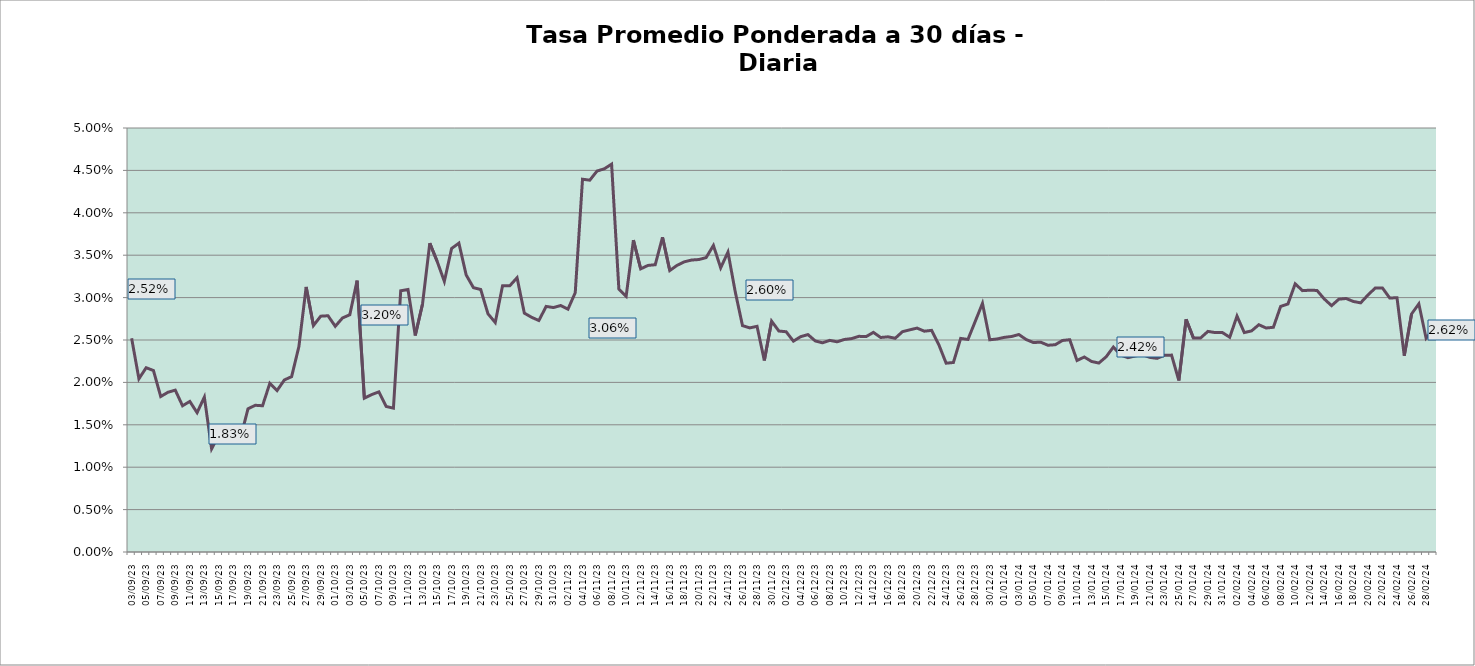
| Category | Tasa a 30 días |
|---|---|
| 2023-09-03 | 0.025 |
| 2023-09-04 | 0.02 |
| 2023-09-05 | 0.022 |
| 2023-09-06 | 0.021 |
| 2023-09-07 | 0.018 |
| 2023-09-08 | 0.019 |
| 2023-09-09 | 0.019 |
| 2023-09-10 | 0.017 |
| 2023-09-11 | 0.018 |
| 2023-09-12 | 0.016 |
| 2023-09-13 | 0.018 |
| 2023-09-14 | 0.012 |
| 2023-09-15 | 0.014 |
| 2023-09-16 | 0.014 |
| 2023-09-17 | 0.015 |
| 2023-09-18 | 0.014 |
| 2023-09-19 | 0.017 |
| 2023-09-20 | 0.017 |
| 2023-09-21 | 0.017 |
| 2023-09-22 | 0.02 |
| 2023-09-23 | 0.019 |
| 2023-09-24 | 0.02 |
| 2023-09-25 | 0.021 |
| 2023-09-26 | 0.024 |
| 2023-09-27 | 0.031 |
| 2023-09-28 | 0.027 |
| 2023-09-29 | 0.028 |
| 2023-09-30 | 0.028 |
| 2023-10-01 | 0.027 |
| 2023-10-02 | 0.028 |
| 2023-10-03 | 0.028 |
| 2023-10-04 | 0.032 |
| 2023-10-05 | 0.018 |
| 2023-10-06 | 0.019 |
| 2023-10-07 | 0.019 |
| 2023-10-08 | 0.017 |
| 2023-10-09 | 0.017 |
| 2023-10-10 | 0.031 |
| 2023-10-11 | 0.031 |
| 2023-10-12 | 0.026 |
| 2023-10-13 | 0.029 |
| 2023-10-14 | 0.036 |
| 2023-10-15 | 0.034 |
| 2023-10-16 | 0.032 |
| 2023-10-17 | 0.036 |
| 2023-10-18 | 0.036 |
| 2023-10-19 | 0.033 |
| 2023-10-20 | 0.031 |
| 2023-10-21 | 0.031 |
| 2023-10-22 | 0.028 |
| 2023-10-23 | 0.027 |
| 2023-10-24 | 0.031 |
| 2023-10-25 | 0.031 |
| 2023-10-26 | 0.032 |
| 2023-10-27 | 0.028 |
| 2023-10-28 | 0.028 |
| 2023-10-29 | 0.027 |
| 2023-10-30 | 0.029 |
| 2023-10-31 | 0.029 |
| 2023-11-01 | 0.029 |
| 2023-11-02 | 0.029 |
| 2023-11-03 | 0.031 |
| 2023-11-04 | 0.044 |
| 2023-11-05 | 0.044 |
| 2023-11-06 | 0.045 |
| 2023-11-07 | 0.045 |
| 2023-11-08 | 0.046 |
| 2023-11-09 | 0.031 |
| 2023-11-10 | 0.03 |
| 2023-11-11 | 0.037 |
| 2023-11-12 | 0.033 |
| 2023-11-13 | 0.034 |
| 2023-11-14 | 0.034 |
| 2023-11-15 | 0.037 |
| 2023-11-16 | 0.033 |
| 2023-11-17 | 0.034 |
| 2023-11-18 | 0.034 |
| 2023-11-19 | 0.034 |
| 2023-11-20 | 0.034 |
| 2023-11-21 | 0.035 |
| 2023-11-22 | 0.036 |
| 2023-11-23 | 0.034 |
| 2023-11-24 | 0.035 |
| 2023-11-25 | 0.031 |
| 2023-11-26 | 0.027 |
| 2023-11-27 | 0.026 |
| 2023-11-28 | 0.027 |
| 2023-11-29 | 0.023 |
| 2023-11-30 | 0.027 |
| 2023-12-01 | 0.026 |
| 2023-12-02 | 0.026 |
| 2023-12-03 | 0.025 |
| 2023-12-04 | 0.025 |
| 2023-12-05 | 0.026 |
| 2023-12-06 | 0.025 |
| 2023-12-07 | 0.025 |
| 2023-12-08 | 0.025 |
| 2023-12-09 | 0.025 |
| 2023-12-10 | 0.025 |
| 2023-12-11 | 0.025 |
| 2023-12-12 | 0.025 |
| 2023-12-13 | 0.025 |
| 2023-12-14 | 0.026 |
| 2023-12-15 | 0.025 |
| 2023-12-16 | 0.025 |
| 2023-12-17 | 0.025 |
| 2023-12-18 | 0.026 |
| 2023-12-19 | 0.026 |
| 2023-12-20 | 0.026 |
| 2023-12-21 | 0.026 |
| 2023-12-22 | 0.026 |
| 2023-12-23 | 0.024 |
| 2023-12-24 | 0.022 |
| 2023-12-25 | 0.022 |
| 2023-12-26 | 0.025 |
| 2023-12-27 | 0.025 |
| 2023-12-28 | 0.027 |
| 2023-12-29 | 0.029 |
| 2023-12-30 | 0.025 |
| 2023-12-31 | 0.025 |
| 2024-01-01 | 0.025 |
| 2024-01-02 | 0.025 |
| 2024-01-03 | 0.026 |
| 2024-01-04 | 0.025 |
| 2024-01-05 | 0.025 |
| 2024-01-06 | 0.025 |
| 2024-01-07 | 0.024 |
| 2024-01-08 | 0.024 |
| 2024-01-09 | 0.025 |
| 2024-01-10 | 0.025 |
| 2024-01-11 | 0.023 |
| 2024-01-12 | 0.023 |
| 2024-01-13 | 0.022 |
| 2024-01-14 | 0.022 |
| 2024-01-15 | 0.023 |
| 2024-01-16 | 0.024 |
| 2024-01-17 | 0.023 |
| 2024-01-18 | 0.023 |
| 2024-01-19 | 0.023 |
| 2024-01-20 | 0.023 |
| 2024-01-21 | 0.023 |
| 2024-01-22 | 0.023 |
| 2024-01-23 | 0.023 |
| 2024-01-24 | 0.023 |
| 2024-01-25 | 0.02 |
| 2024-01-26 | 0.027 |
| 2024-01-27 | 0.025 |
| 2024-01-28 | 0.025 |
| 2024-01-29 | 0.026 |
| 2024-01-30 | 0.026 |
| 2024-01-31 | 0.026 |
| 2024-02-01 | 0.025 |
| 2024-02-02 | 0.028 |
| 2024-02-03 | 0.026 |
| 2024-02-04 | 0.026 |
| 2024-02-05 | 0.027 |
| 2024-02-06 | 0.026 |
| 2024-02-07 | 0.026 |
| 2024-02-08 | 0.029 |
| 2024-02-09 | 0.029 |
| 2024-02-10 | 0.032 |
| 2024-02-11 | 0.031 |
| 2024-02-12 | 0.031 |
| 2024-02-13 | 0.031 |
| 2024-02-14 | 0.03 |
| 2024-02-15 | 0.029 |
| 2024-02-16 | 0.03 |
| 2024-02-17 | 0.03 |
| 2024-02-18 | 0.03 |
| 2024-02-19 | 0.029 |
| 2024-02-20 | 0.03 |
| 2024-02-21 | 0.031 |
| 2024-02-22 | 0.031 |
| 2024-02-23 | 0.03 |
| 2024-02-24 | 0.03 |
| 2024-02-25 | 0.023 |
| 2024-02-26 | 0.028 |
| 2024-02-27 | 0.029 |
| 2024-02-28 | 0.025 |
| 2024-02-29 | 0.026 |